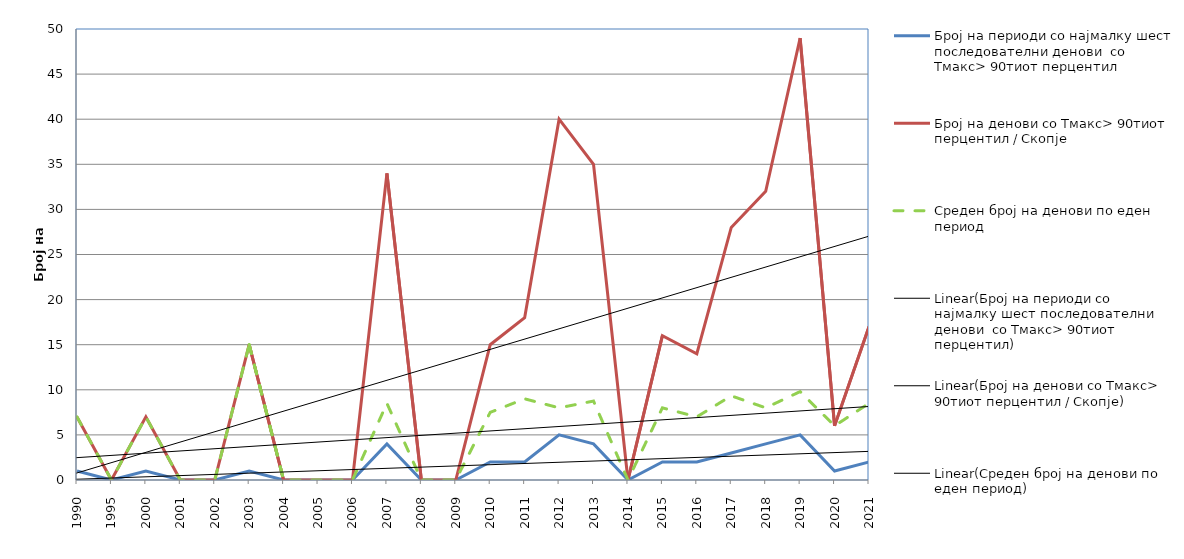
| Category | Број на периоди со најмалку шест последователни денови  со Тмакс> 90тиот перцентил | Број на денови со Тмакс> 90тиот перцентил / Скопје | Среден број на денови по еден период |
|---|---|---|---|
| 1990.0 | 1 | 7 | 7 |
| 1995.0 | 0 | 0 | 0 |
| 2000.0 | 1 | 7 | 7 |
| 2001.0 | 0 | 0 | 0 |
| 2002.0 | 0 | 0 | 0 |
| 2003.0 | 1 | 15 | 15 |
| 2004.0 | 0 | 0 | 0 |
| 2005.0 | 0 | 0 | 0 |
| 2006.0 | 0 | 0 | 0 |
| 2007.0 | 4 | 34 | 8.5 |
| 2008.0 | 0 | 0 | 0 |
| 2009.0 | 0 | 0 | 0 |
| 2010.0 | 2 | 15 | 7.5 |
| 2011.0 | 2 | 18 | 9 |
| 2012.0 | 5 | 40 | 8 |
| 2013.0 | 4 | 35 | 8.75 |
| 2014.0 | 0 | 0 | 0 |
| 2015.0 | 2 | 16 | 8 |
| 2016.0 | 2 | 14 | 7 |
| 2017.0 | 3 | 28 | 9.333 |
| 2018.0 | 4 | 32 | 8 |
| 2019.0 | 5 | 49 | 9.8 |
| 2020.0 | 1 | 6 | 6 |
| 2021.0 | 2 | 17 | 8.5 |